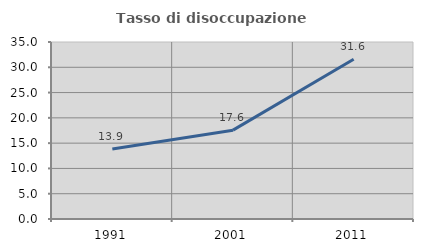
| Category | Tasso di disoccupazione giovanile  |
|---|---|
| 1991.0 | 13.861 |
| 2001.0 | 17.568 |
| 2011.0 | 31.579 |